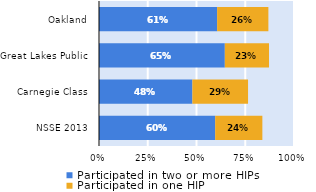
| Category | Participated in two or more HIPs | Participated in one HIP |
|---|---|---|
| NSSE 2013 | 0.596 | 0.242 |
| Carnegie Class | 0.479 | 0.285 |
| Great Lakes Public | 0.645 | 0.227 |
| Oakland | 0.606 | 0.263 |